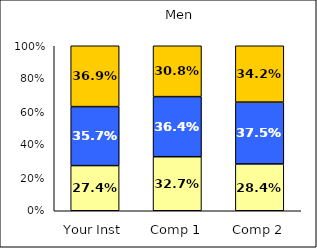
| Category | Low Pluralistic Orientation | Average Pluralistic Orientation | High Pluralistic Orientation |
|---|---|---|---|
| Your Inst | 0.274 | 0.357 | 0.369 |
| Comp 1 | 0.327 | 0.364 | 0.308 |
| Comp 2 | 0.284 | 0.375 | 0.342 |